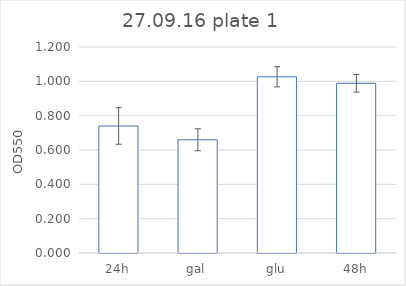
| Category | Series 0 |
|---|---|
| 24h | 0.74 |
| gal | 0.66 |
| glu | 1.027 |
| 48h | 0.988 |